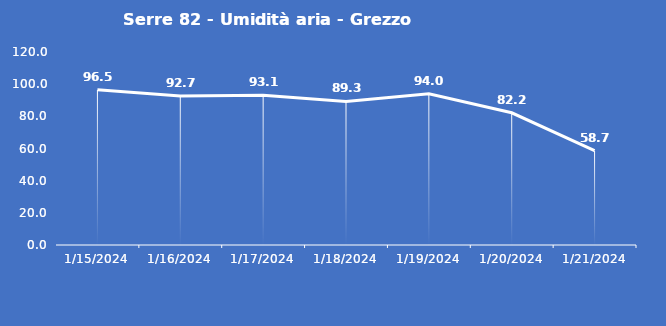
| Category | Serre 82 - Umidità aria - Grezzo (%) |
|---|---|
| 1/15/24 | 96.5 |
| 1/16/24 | 92.7 |
| 1/17/24 | 93.1 |
| 1/18/24 | 89.3 |
| 1/19/24 | 94 |
| 1/20/24 | 82.2 |
| 1/21/24 | 58.7 |